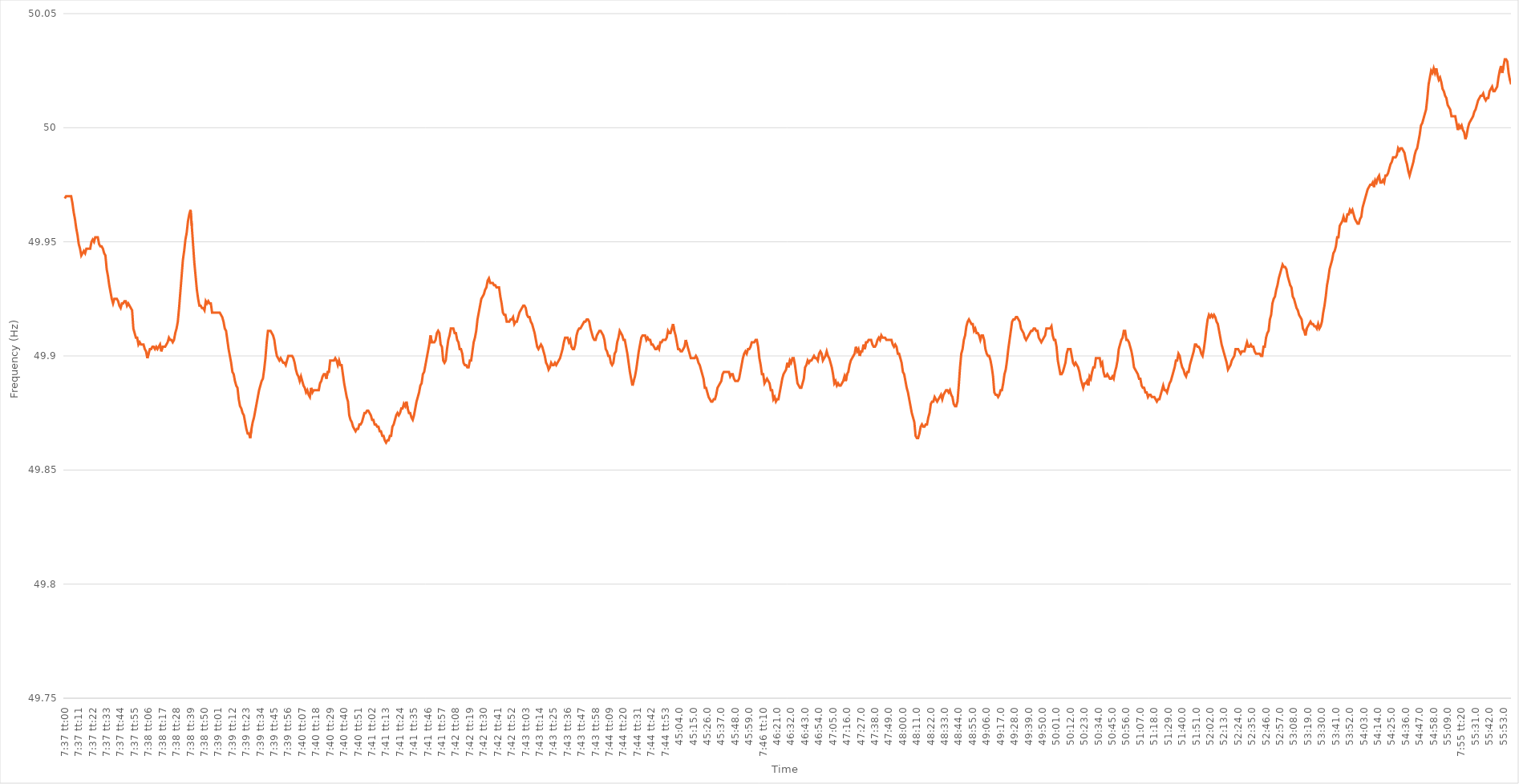
| Category | Series 0 |
|---|---|
| 0.31736111111111115 | 49.969 |
| 0.3173726851851852 | 49.97 |
| 0.3173842592592592 | 49.97 |
| 0.3173958333333333 | 49.97 |
| 0.3174074074074074 | 49.97 |
| 0.31741898148148145 | 49.97 |
| 0.31743055555555555 | 49.967 |
| 0.31744212962962964 | 49.963 |
| 0.3174537037037037 | 49.96 |
| 0.3174652777777778 | 49.956 |
| 0.31747685185185187 | 49.953 |
| 0.3174884259259259 | 49.949 |
| 0.3175 | 49.947 |
| 0.3175115740740741 | 49.944 |
| 0.31752314814814814 | 49.945 |
| 0.31753472222222223 | 49.946 |
| 0.3175462962962963 | 49.945 |
| 0.31755787037037037 | 49.947 |
| 0.3175694444444444 | 49.947 |
| 0.31758101851851855 | 49.947 |
| 0.3175925925925926 | 49.947 |
| 0.3176041666666667 | 49.95 |
| 0.3176157407407407 | 49.951 |
| 0.3176273148148148 | 49.95 |
| 0.31763888888888886 | 49.952 |
| 0.31765046296296295 | 49.952 |
| 0.31766203703703705 | 49.952 |
| 0.3176736111111111 | 49.949 |
| 0.3176851851851852 | 49.948 |
| 0.3176967592592593 | 49.948 |
| 0.3177083333333333 | 49.947 |
| 0.3177199074074074 | 49.945 |
| 0.3177314814814815 | 49.944 |
| 0.31774305555555554 | 49.938 |
| 0.31775462962962964 | 49.935 |
| 0.31776620370370373 | 49.931 |
| 0.31777777777777777 | 49.928 |
| 0.31778935185185186 | 49.925 |
| 0.31780092592592596 | 49.923 |
| 0.3178125 | 49.925 |
| 0.3178240740740741 | 49.925 |
| 0.31783564814814813 | 49.925 |
| 0.3178472222222222 | 49.924 |
| 0.31785879629629626 | 49.922 |
| 0.31787037037037036 | 49.921 |
| 0.31788194444444445 | 49.923 |
| 0.3178935185185185 | 49.923 |
| 0.3179050925925926 | 49.924 |
| 0.3179166666666667 | 49.924 |
| 0.3179282407407407 | 49.922 |
| 0.3179398148148148 | 49.923 |
| 0.3179513888888889 | 49.922 |
| 0.31796296296296295 | 49.921 |
| 0.31797453703703704 | 49.92 |
| 0.31798611111111114 | 49.912 |
| 0.3179976851851852 | 49.91 |
| 0.31800925925925927 | 49.908 |
| 0.31802083333333336 | 49.908 |
| 0.3180324074074074 | 49.905 |
| 0.3180439814814815 | 49.906 |
| 0.31805555555555554 | 49.905 |
| 0.31806712962962963 | 49.905 |
| 0.31807870370370367 | 49.905 |
| 0.31809027777777776 | 49.903 |
| 0.31810185185185186 | 49.902 |
| 0.3181134259259259 | 49.899 |
| 0.318125 | 49.901 |
| 0.3181365740740741 | 49.903 |
| 0.3181481481481481 | 49.903 |
| 0.3181597222222222 | 49.904 |
| 0.3181712962962963 | 49.904 |
| 0.31818287037037035 | 49.903 |
| 0.31819444444444445 | 49.904 |
| 0.31820601851851854 | 49.903 |
| 0.3182175925925926 | 49.904 |
| 0.3182291666666667 | 49.905 |
| 0.31824074074074077 | 49.902 |
| 0.3182523148148148 | 49.904 |
| 0.3182638888888889 | 49.904 |
| 0.318275462962963 | 49.904 |
| 0.31828703703703703 | 49.905 |
| 0.3182986111111111 | 49.906 |
| 0.3183101851851852 | 49.908 |
| 0.31832175925925926 | 49.907 |
| 0.3183333333333333 | 49.907 |
| 0.3183449074074074 | 49.906 |
| 0.3183564814814815 | 49.907 |
| 0.31836805555555553 | 49.91 |
| 0.3183796296296296 | 49.912 |
| 0.3183912037037037 | 49.915 |
| 0.31840277777777776 | 49.921 |
| 0.31841435185185185 | 49.928 |
| 0.31842592592592595 | 49.935 |
| 0.3184375 | 49.942 |
| 0.3184490740740741 | 49.946 |
| 0.3184606481481482 | 49.951 |
| 0.3184722222222222 | 49.954 |
| 0.3184837962962963 | 49.959 |
| 0.3184953703703704 | 49.962 |
| 0.31850694444444444 | 49.964 |
| 0.3185185185185185 | 49.957 |
| 0.31853009259259263 | 49.949 |
| 0.31854166666666667 | 49.941 |
| 0.31855324074074076 | 49.935 |
| 0.3185648148148148 | 49.929 |
| 0.3185763888888889 | 49.925 |
| 0.31858796296296293 | 49.922 |
| 0.31859953703703703 | 49.922 |
| 0.3186111111111111 | 49.921 |
| 0.31862268518518516 | 49.921 |
| 0.31863425925925926 | 49.92 |
| 0.31864583333333335 | 49.924 |
| 0.3186574074074074 | 49.923 |
| 0.3186689814814815 | 49.924 |
| 0.3186805555555556 | 49.923 |
| 0.3186921296296296 | 49.923 |
| 0.3187037037037037 | 49.919 |
| 0.3187152777777778 | 49.919 |
| 0.31872685185185184 | 49.919 |
| 0.31873842592592594 | 49.919 |
| 0.31875000000000003 | 49.919 |
| 0.31876157407407407 | 49.919 |
| 0.31877314814814817 | 49.919 |
| 0.3187847222222222 | 49.918 |
| 0.3187962962962963 | 49.917 |
| 0.31880787037037034 | 49.915 |
| 0.31881944444444443 | 49.912 |
| 0.3188310185185185 | 49.911 |
| 0.31884259259259257 | 49.907 |
| 0.31885416666666666 | 49.903 |
| 0.31886574074074076 | 49.9 |
| 0.3188773148148148 | 49.897 |
| 0.3188888888888889 | 49.893 |
| 0.318900462962963 | 49.892 |
| 0.318912037037037 | 49.889 |
| 0.3189236111111111 | 49.887 |
| 0.3189351851851852 | 49.886 |
| 0.31894675925925925 | 49.881 |
| 0.31895833333333334 | 49.878 |
| 0.31896990740740744 | 49.877 |
| 0.3189814814814815 | 49.875 |
| 0.31899305555555557 | 49.874 |
| 0.3190046296296296 | 49.871 |
| 0.3190162037037037 | 49.868 |
| 0.31902777777777774 | 49.866 |
| 0.31903935185185184 | 49.866 |
| 0.31905092592592593 | 49.864 |
| 0.31906249999999997 | 49.868 |
| 0.31907407407407407 | 49.871 |
| 0.31908564814814816 | 49.873 |
| 0.3190972222222222 | 49.876 |
| 0.3191087962962963 | 49.879 |
| 0.3191203703703704 | 49.882 |
| 0.3191319444444444 | 49.885 |
| 0.3191435185185185 | 49.887 |
| 0.3191550925925926 | 49.889 |
| 0.31916666666666665 | 49.89 |
| 0.31917824074074075 | 49.894 |
| 0.31918981481481484 | 49.899 |
| 0.3192013888888889 | 49.906 |
| 0.319212962962963 | 49.911 |
| 0.319224537037037 | 49.911 |
| 0.3192361111111111 | 49.911 |
| 0.31924768518518515 | 49.91 |
| 0.3192592592592593 | 49.909 |
| 0.31927083333333334 | 49.907 |
| 0.3192824074074074 | 49.903 |
| 0.31929398148148147 | 49.9 |
| 0.31930555555555556 | 49.899 |
| 0.3193171296296296 | 49.898 |
| 0.3193287037037037 | 49.899 |
| 0.3193402777777778 | 49.898 |
| 0.31935185185185183 | 49.897 |
| 0.3193634259259259 | 49.897 |
| 0.319375 | 49.896 |
| 0.31938657407407406 | 49.898 |
| 0.31939814814814815 | 49.9 |
| 0.31940972222222225 | 49.9 |
| 0.3194212962962963 | 49.9 |
| 0.3194328703703704 | 49.9 |
| 0.3194444444444445 | 49.899 |
| 0.3194560185185185 | 49.897 |
| 0.31946759259259255 | 49.894 |
| 0.3194791666666667 | 49.892 |
| 0.31949074074074074 | 49.891 |
| 0.31950231481481484 | 49.889 |
| 0.3195138888888889 | 49.891 |
| 0.31952546296296297 | 49.889 |
| 0.319537037037037 | 49.887 |
| 0.3195486111111111 | 49.886 |
| 0.3195601851851852 | 49.884 |
| 0.31957175925925924 | 49.885 |
| 0.31958333333333333 | 49.883 |
| 0.3195949074074074 | 49.882 |
| 0.31960648148148146 | 49.886 |
| 0.31961805555555556 | 49.884 |
| 0.31962962962962965 | 49.885 |
| 0.3196412037037037 | 49.885 |
| 0.3196527777777778 | 49.885 |
| 0.3196643518518519 | 49.885 |
| 0.3196759259259259 | 49.885 |
| 0.3196875 | 49.888 |
| 0.3196990740740741 | 49.889 |
| 0.31971064814814815 | 49.891 |
| 0.31972222222222224 | 49.892 |
| 0.3197337962962963 | 49.892 |
| 0.3197453703703704 | 49.89 |
| 0.3197569444444444 | 49.893 |
| 0.3197685185185185 | 49.893 |
| 0.3197800925925926 | 49.898 |
| 0.31979166666666664 | 49.898 |
| 0.31980324074074074 | 49.898 |
| 0.31981481481481483 | 49.898 |
| 0.31982638888888887 | 49.899 |
| 0.31983796296296296 | 49.898 |
| 0.31984953703703706 | 49.896 |
| 0.3198611111111111 | 49.898 |
| 0.3198726851851852 | 49.896 |
| 0.3198842592592593 | 49.896 |
| 0.3198958333333333 | 49.892 |
| 0.3199074074074074 | 49.888 |
| 0.3199189814814815 | 49.885 |
| 0.31993055555555555 | 49.882 |
| 0.31994212962962965 | 49.88 |
| 0.3199537037037037 | 49.874 |
| 0.3199652777777778 | 49.872 |
| 0.3199768518518518 | 49.871 |
| 0.3199884259259259 | 49.869 |
| 0.32 | 49.868 |
| 0.32001157407407405 | 49.867 |
| 0.32002314814814814 | 49.868 |
| 0.32003472222222223 | 49.868 |
| 0.3200462962962963 | 49.87 |
| 0.32005787037037037 | 49.87 |
| 0.32006944444444446 | 49.871 |
| 0.3200810185185185 | 49.873 |
| 0.3200925925925926 | 49.875 |
| 0.3201041666666667 | 49.875 |
| 0.32011574074074073 | 49.876 |
| 0.3201273148148148 | 49.876 |
| 0.3201388888888889 | 49.875 |
| 0.32015046296296296 | 49.874 |
| 0.32016203703703705 | 49.872 |
| 0.3201736111111111 | 49.872 |
| 0.3201851851851852 | 49.87 |
| 0.3201967592592592 | 49.87 |
| 0.3202083333333334 | 49.869 |
| 0.3202199074074074 | 49.869 |
| 0.32023148148148145 | 49.867 |
| 0.32024305555555554 | 49.867 |
| 0.32025462962962964 | 49.865 |
| 0.3202662037037037 | 49.865 |
| 0.3202777777777778 | 49.863 |
| 0.32028935185185187 | 49.862 |
| 0.3203009259259259 | 49.863 |
| 0.3203125 | 49.863 |
| 0.3203240740740741 | 49.865 |
| 0.32033564814814813 | 49.865 |
| 0.3203472222222222 | 49.869 |
| 0.3203587962962963 | 49.87 |
| 0.32037037037037036 | 49.872 |
| 0.32038194444444446 | 49.874 |
| 0.32039351851851855 | 49.875 |
| 0.3204050925925926 | 49.874 |
| 0.3204166666666666 | 49.875 |
| 0.3204282407407408 | 49.877 |
| 0.3204398148148148 | 49.877 |
| 0.3204513888888889 | 49.879 |
| 0.32046296296296295 | 49.878 |
| 0.32047453703703704 | 49.88 |
| 0.3204861111111111 | 49.877 |
| 0.3204976851851852 | 49.875 |
| 0.32050925925925927 | 49.875 |
| 0.3205208333333333 | 49.873 |
| 0.3205324074074074 | 49.872 |
| 0.3205439814814815 | 49.874 |
| 0.32055555555555554 | 49.877 |
| 0.32056712962962963 | 49.88 |
| 0.3205787037037037 | 49.882 |
| 0.32059027777777777 | 49.884 |
| 0.32060185185185186 | 49.887 |
| 0.32061342592592595 | 49.888 |
| 0.320625 | 49.892 |
| 0.3206365740740741 | 49.893 |
| 0.3206481481481482 | 49.896 |
| 0.3206597222222222 | 49.899 |
| 0.3206712962962963 | 49.902 |
| 0.32068287037037035 | 49.905 |
| 0.32069444444444445 | 49.909 |
| 0.3207060185185185 | 49.906 |
| 0.3207175925925926 | 49.906 |
| 0.3207291666666667 | 49.906 |
| 0.3207407407407407 | 49.907 |
| 0.3207523148148148 | 49.91 |
| 0.3207638888888889 | 49.911 |
| 0.32077546296296294 | 49.91 |
| 0.32078703703703704 | 49.905 |
| 0.32079861111111113 | 49.904 |
| 0.32081018518518517 | 49.898 |
| 0.32082175925925926 | 49.897 |
| 0.32083333333333336 | 49.898 |
| 0.3208449074074074 | 49.903 |
| 0.3208564814814815 | 49.907 |
| 0.3208680555555556 | 49.909 |
| 0.3208796296296296 | 49.912 |
| 0.3208912037037037 | 49.912 |
| 0.32090277777777776 | 49.912 |
| 0.32091435185185185 | 49.91 |
| 0.3209259259259259 | 49.91 |
| 0.3209375 | 49.907 |
| 0.3209490740740741 | 49.906 |
| 0.3209606481481481 | 49.903 |
| 0.3209722222222222 | 49.903 |
| 0.3209837962962963 | 49.901 |
| 0.32099537037037035 | 49.897 |
| 0.32100694444444444 | 49.896 |
| 0.32101851851851854 | 49.896 |
| 0.3210300925925926 | 49.895 |
| 0.32104166666666667 | 49.895 |
| 0.32105324074074076 | 49.898 |
| 0.3210648148148148 | 49.898 |
| 0.3210763888888889 | 49.902 |
| 0.321087962962963 | 49.906 |
| 0.32109953703703703 | 49.908 |
| 0.3211111111111111 | 49.911 |
| 0.32112268518518516 | 49.916 |
| 0.32113425925925926 | 49.919 |
| 0.3211458333333333 | 49.922 |
| 0.32115740740740745 | 49.925 |
| 0.3211689814814815 | 49.926 |
| 0.3211805555555555 | 49.927 |
| 0.3211921296296296 | 49.929 |
| 0.3212037037037037 | 49.93 |
| 0.32121527777777775 | 49.933 |
| 0.32122685185185185 | 49.934 |
| 0.32123842592592594 | 49.932 |
| 0.32125 | 49.932 |
| 0.3212615740740741 | 49.932 |
| 0.32127314814814817 | 49.931 |
| 0.3212847222222222 | 49.931 |
| 0.3212962962962963 | 49.93 |
| 0.3213078703703704 | 49.93 |
| 0.32131944444444444 | 49.93 |
| 0.32133101851851853 | 49.926 |
| 0.3213425925925926 | 49.923 |
| 0.32135416666666666 | 49.919 |
| 0.3213657407407407 | 49.918 |
| 0.32137731481481485 | 49.918 |
| 0.3213888888888889 | 49.915 |
| 0.321400462962963 | 49.915 |
| 0.321412037037037 | 49.915 |
| 0.3214236111111111 | 49.916 |
| 0.32143518518518516 | 49.916 |
| 0.32144675925925925 | 49.917 |
| 0.32145833333333335 | 49.914 |
| 0.3214699074074074 | 49.915 |
| 0.3214814814814815 | 49.915 |
| 0.3214930555555556 | 49.917 |
| 0.3215046296296296 | 49.919 |
| 0.3215162037037037 | 49.92 |
| 0.3215277777777778 | 49.921 |
| 0.32153935185185184 | 49.922 |
| 0.32155092592592593 | 49.922 |
| 0.32156250000000003 | 49.921 |
| 0.32157407407407407 | 49.918 |
| 0.32158564814814816 | 49.917 |
| 0.32159722222222226 | 49.917 |
| 0.3216087962962963 | 49.915 |
| 0.3216203703703704 | 49.914 |
| 0.32163194444444443 | 49.912 |
| 0.3216435185185185 | 49.91 |
| 0.32165509259259256 | 49.907 |
| 0.32166666666666666 | 49.904 |
| 0.32167824074074075 | 49.903 |
| 0.3216898148148148 | 49.904 |
| 0.3217013888888889 | 49.905 |
| 0.321712962962963 | 49.904 |
| 0.321724537037037 | 49.902 |
| 0.3217361111111111 | 49.9 |
| 0.3217476851851852 | 49.897 |
| 0.32175925925925924 | 49.896 |
| 0.32177083333333334 | 49.894 |
| 0.32178240740740743 | 49.895 |
| 0.3217939814814815 | 49.897 |
| 0.32180555555555557 | 49.896 |
| 0.32181712962962966 | 49.896 |
| 0.3218287037037037 | 49.897 |
| 0.3218402777777778 | 49.896 |
| 0.32185185185185183 | 49.897 |
| 0.32186342592592593 | 49.898 |
| 0.32187499999999997 | 49.899 |
| 0.32188657407407406 | 49.901 |
| 0.32189814814814816 | 49.903 |
| 0.3219097222222222 | 49.906 |
| 0.3219212962962963 | 49.908 |
| 0.3219328703703704 | 49.908 |
| 0.3219444444444444 | 49.908 |
| 0.3219560185185185 | 49.906 |
| 0.3219675925925926 | 49.907 |
| 0.32197916666666665 | 49.904 |
| 0.32199074074074074 | 49.903 |
| 0.32200231481481484 | 49.903 |
| 0.3220138888888889 | 49.905 |
| 0.32202546296296297 | 49.909 |
| 0.32203703703703707 | 49.911 |
| 0.3220486111111111 | 49.912 |
| 0.3220601851851852 | 49.912 |
| 0.32207175925925924 | 49.913 |
| 0.32208333333333333 | 49.914 |
| 0.32209490740740737 | 49.915 |
| 0.3221064814814815 | 49.915 |
| 0.32211805555555556 | 49.916 |
| 0.3221296296296296 | 49.916 |
| 0.3221412037037037 | 49.915 |
| 0.3221527777777778 | 49.912 |
| 0.3221643518518518 | 49.91 |
| 0.3221759259259259 | 49.908 |
| 0.3221875 | 49.907 |
| 0.32219907407407405 | 49.907 |
| 0.32221064814814815 | 49.909 |
| 0.32222222222222224 | 49.91 |
| 0.3222337962962963 | 49.911 |
| 0.3222453703703704 | 49.911 |
| 0.32225694444444447 | 49.91 |
| 0.3222685185185185 | 49.909 |
| 0.3222800925925926 | 49.907 |
| 0.3222916666666667 | 49.903 |
| 0.32230324074074074 | 49.902 |
| 0.3223148148148148 | 49.9 |
| 0.3223263888888889 | 49.9 |
| 0.32233796296296297 | 49.897 |
| 0.322349537037037 | 49.896 |
| 0.3223611111111111 | 49.897 |
| 0.3223726851851852 | 49.901 |
| 0.32238425925925923 | 49.902 |
| 0.3223958333333333 | 49.906 |
| 0.3224074074074074 | 49.908 |
| 0.32241898148148146 | 49.911 |
| 0.32243055555555555 | 49.91 |
| 0.32244212962962965 | 49.909 |
| 0.3224537037037037 | 49.907 |
| 0.3224652777777778 | 49.907 |
| 0.3224768518518519 | 49.904 |
| 0.3224884259259259 | 49.901 |
| 0.3225 | 49.897 |
| 0.3225115740740741 | 49.893 |
| 0.32252314814814814 | 49.89 |
| 0.32253472222222224 | 49.887 |
| 0.32254629629629633 | 49.889 |
| 0.32255787037037037 | 49.891 |
| 0.32256944444444446 | 49.894 |
| 0.3225810185185185 | 49.898 |
| 0.3225925925925926 | 49.902 |
| 0.32260416666666664 | 49.905 |
| 0.32261574074074073 | 49.908 |
| 0.3226273148148148 | 49.909 |
| 0.32263888888888886 | 49.909 |
| 0.32265046296296296 | 49.909 |
| 0.32266203703703705 | 49.907 |
| 0.3226736111111111 | 49.908 |
| 0.3226851851851852 | 49.907 |
| 0.3226967592592593 | 49.907 |
| 0.3227083333333333 | 49.905 |
| 0.3227199074074074 | 49.905 |
| 0.3227314814814815 | 49.904 |
| 0.32274305555555555 | 49.903 |
| 0.32275462962962964 | 49.903 |
| 0.32276620370370374 | 49.904 |
| 0.3227777777777778 | 49.903 |
| 0.32278935185185187 | 49.906 |
| 0.3228009259259259 | 49.906 |
| 0.3228125 | 49.907 |
| 0.32282407407407404 | 49.907 |
| 0.32283564814814814 | 49.907 |
| 0.32284722222222223 | 49.908 |
| 0.32285879629629627 | 49.911 |
| 0.32287037037037036 | 49.91 |
| 0.32288194444444446 | 49.91 |
| 0.3228935185185185 | 49.912 |
| 0.3229050925925926 | 49.914 |
| 0.3229166666666667 | 49.911 |
| 0.3229282407407407 | 49.909 |
| 0.3229398148148148 | 49.906 |
| 0.3229513888888889 | 49.903 |
| 0.32296296296296295 | 49.903 |
| 0.32297453703703705 | 49.902 |
| 0.32298611111111114 | 49.902 |
| 0.3229976851851852 | 49.903 |
| 0.3230092592592593 | 49.904 |
| 0.3230208333333333 | 49.907 |
| 0.3230324074074074 | 49.905 |
| 0.32304398148148145 | 49.903 |
| 0.3230555555555556 | 49.901 |
| 0.32306712962962963 | 49.899 |
| 0.3230787037037037 | 49.899 |
| 0.32309027777777777 | 49.899 |
| 0.32310185185185186 | 49.899 |
| 0.3231134259259259 | 49.9 |
| 0.323125 | 49.899 |
| 0.3231365740740741 | 49.897 |
| 0.32314814814814813 | 49.896 |
| 0.3231597222222222 | 49.894 |
| 0.3231712962962963 | 49.892 |
| 0.32318287037037036 | 49.89 |
| 0.32319444444444445 | 49.886 |
| 0.32320601851851855 | 49.886 |
| 0.3232175925925926 | 49.884 |
| 0.3232291666666667 | 49.882 |
| 0.3232407407407408 | 49.881 |
| 0.3232523148148148 | 49.88 |
| 0.32326388888888885 | 49.88 |
| 0.323275462962963 | 49.881 |
| 0.32328703703703704 | 49.881 |
| 0.3232986111111111 | 49.883 |
| 0.3233101851851852 | 49.886 |
| 0.32332175925925927 | 49.887 |
| 0.3233333333333333 | 49.888 |
| 0.3233449074074074 | 49.889 |
| 0.3233564814814815 | 49.892 |
| 0.32336805555555553 | 49.893 |
| 0.32337962962962963 | 49.893 |
| 0.3233912037037037 | 49.893 |
| 0.32340277777777776 | 49.893 |
| 0.32341435185185186 | 49.893 |
| 0.32342592592592595 | 49.891 |
| 0.3234375 | 49.892 |
| 0.3234490740740741 | 49.892 |
| 0.3234606481481482 | 49.89 |
| 0.3234722222222222 | 49.889 |
| 0.3234837962962963 | 49.889 |
| 0.3234953703703704 | 49.889 |
| 0.32350694444444444 | 49.89 |
| 0.32351851851851854 | 49.893 |
| 0.3235300925925926 | 49.896 |
| 0.32354166666666667 | 49.899 |
| 0.3235532407407407 | 49.901 |
| 0.3235648148148148 | 49.902 |
| 0.3235763888888889 | 49.901 |
| 0.32358796296296294 | 49.903 |
| 0.32359953703703703 | 49.903 |
| 0.3236111111111111 | 49.904 |
| 0.32362268518518517 | 49.906 |
| 0.32363425925925926 | 49.906 |
| 0.32364583333333335 | 49.906 |
| 0.3236574074074074 | 49.907 |
| 0.3236689814814815 | 49.907 |
| 0.3236805555555556 | 49.904 |
| 0.3236921296296296 | 49.899 |
| 0.3237037037037037 | 49.896 |
| 0.3237152777777778 | 49.892 |
| 0.32372685185185185 | 49.892 |
| 0.32373842592592594 | 49.888 |
| 0.32375 | 49.889 |
| 0.3237615740740741 | 49.89 |
| 0.3237731481481481 | 49.889 |
| 0.3237847222222222 | 49.888 |
| 0.3237962962962963 | 49.885 |
| 0.32380787037037034 | 49.885 |
| 0.32381944444444444 | 49.881 |
| 0.32383101851851853 | 49.882 |
| 0.32384259259259257 | 49.88 |
| 0.32385416666666667 | 49.881 |
| 0.32386574074074076 | 49.881 |
| 0.3238773148148148 | 49.884 |
| 0.3238888888888889 | 49.887 |
| 0.323900462962963 | 49.89 |
| 0.323912037037037 | 49.892 |
| 0.3239236111111111 | 49.893 |
| 0.3239351851851852 | 49.894 |
| 0.32394675925925925 | 49.897 |
| 0.32395833333333335 | 49.895 |
| 0.3239699074074074 | 49.898 |
| 0.3239814814814815 | 49.897 |
| 0.3239930555555555 | 49.899 |
| 0.32400462962962967 | 49.899 |
| 0.3240162037037037 | 49.896 |
| 0.32402777777777775 | 49.892 |
| 0.32403935185185184 | 49.888 |
| 0.32405092592592594 | 49.887 |
| 0.3240625 | 49.886 |
| 0.32407407407407407 | 49.886 |
| 0.32408564814814816 | 49.888 |
| 0.3240972222222222 | 49.89 |
| 0.3241087962962963 | 49.895 |
| 0.3241203703703704 | 49.896 |
| 0.32413194444444443 | 49.898 |
| 0.3241435185185185 | 49.897 |
| 0.3241550925925926 | 49.898 |
| 0.32416666666666666 | 49.898 |
| 0.32417824074074075 | 49.899 |
| 0.32418981481481485 | 49.9 |
| 0.3242013888888889 | 49.899 |
| 0.3242129629629629 | 49.899 |
| 0.3242245370370371 | 49.898 |
| 0.3242361111111111 | 49.901 |
| 0.32424768518518515 | 49.902 |
| 0.32425925925925925 | 49.901 |
| 0.32427083333333334 | 49.898 |
| 0.3242824074074074 | 49.899 |
| 0.3242939814814815 | 49.9 |
| 0.32430555555555557 | 49.902 |
| 0.3243171296296296 | 49.9 |
| 0.3243287037037037 | 49.899 |
| 0.3243402777777778 | 49.897 |
| 0.32435185185185184 | 49.895 |
| 0.32436342592592593 | 49.892 |
| 0.324375 | 49.888 |
| 0.32438657407407406 | 49.889 |
| 0.32439814814814816 | 49.887 |
| 0.32440972222222225 | 49.888 |
| 0.3244212962962963 | 49.887 |
| 0.32443287037037033 | 49.887 |
| 0.3244444444444445 | 49.888 |
| 0.3244560185185185 | 49.889 |
| 0.3244675925925926 | 49.891 |
| 0.32447916666666665 | 49.889 |
| 0.32449074074074075 | 49.892 |
| 0.3245023148148148 | 49.893 |
| 0.3245138888888889 | 49.896 |
| 0.324525462962963 | 49.898 |
| 0.324537037037037 | 49.899 |
| 0.3245486111111111 | 49.9 |
| 0.3245601851851852 | 49.901 |
| 0.32457175925925924 | 49.904 |
| 0.32458333333333333 | 49.902 |
| 0.32459490740740743 | 49.903 |
| 0.32460648148148147 | 49.9 |
| 0.32461805555555556 | 49.902 |
| 0.32462962962962966 | 49.902 |
| 0.3246412037037037 | 49.905 |
| 0.3246527777777778 | 49.903 |
| 0.3246643518518519 | 49.906 |
| 0.3246759259259259 | 49.906 |
| 0.3246875 | 49.907 |
| 0.32469907407407406 | 49.907 |
| 0.32471064814814815 | 49.907 |
| 0.3247222222222222 | 49.905 |
| 0.3247337962962963 | 49.904 |
| 0.3247453703703704 | 49.904 |
| 0.3247569444444444 | 49.905 |
| 0.3247685185185185 | 49.907 |
| 0.3247800925925926 | 49.908 |
| 0.32479166666666665 | 49.907 |
| 0.32480324074074074 | 49.909 |
| 0.32481481481481483 | 49.908 |
| 0.3248263888888889 | 49.908 |
| 0.32483796296296297 | 49.908 |
| 0.32484953703703706 | 49.907 |
| 0.3248611111111111 | 49.907 |
| 0.3248726851851852 | 49.907 |
| 0.3248842592592593 | 49.907 |
| 0.32489583333333333 | 49.907 |
| 0.3249074074074074 | 49.905 |
| 0.32491898148148146 | 49.904 |
| 0.32493055555555556 | 49.905 |
| 0.3249421296296296 | 49.904 |
| 0.3249537037037037 | 49.901 |
| 0.3249652777777778 | 49.901 |
| 0.3249768518518518 | 49.899 |
| 0.3249884259259259 | 49.897 |
| 0.325 | 49.893 |
| 0.32501157407407405 | 49.892 |
| 0.32502314814814814 | 49.889 |
| 0.32503472222222224 | 49.886 |
| 0.3250462962962963 | 49.884 |
| 0.32505787037037037 | 49.881 |
| 0.32506944444444447 | 49.878 |
| 0.3250810185185185 | 49.875 |
| 0.3250925925925926 | 49.873 |
| 0.3251041666666667 | 49.871 |
| 0.32511574074074073 | 49.865 |
| 0.3251273148148148 | 49.864 |
| 0.3251388888888889 | 49.864 |
| 0.32515046296296296 | 49.866 |
| 0.325162037037037 | 49.869 |
| 0.32517361111111115 | 49.87 |
| 0.3251851851851852 | 49.869 |
| 0.3251967592592592 | 49.869 |
| 0.3252083333333333 | 49.87 |
| 0.3252199074074074 | 49.87 |
| 0.32523148148148145 | 49.873 |
| 0.32524305555555555 | 49.875 |
| 0.32525462962962964 | 49.879 |
| 0.3252662037037037 | 49.88 |
| 0.3252777777777778 | 49.88 |
| 0.32528935185185187 | 49.882 |
| 0.3253009259259259 | 49.881 |
| 0.3253125 | 49.88 |
| 0.3253240740740741 | 49.881 |
| 0.32533564814814814 | 49.882 |
| 0.32534722222222223 | 49.883 |
| 0.3253587962962963 | 49.881 |
| 0.32537037037037037 | 49.883 |
| 0.3253819444444444 | 49.884 |
| 0.32539351851851855 | 49.885 |
| 0.3254050925925926 | 49.885 |
| 0.3254166666666667 | 49.884 |
| 0.3254282407407407 | 49.885 |
| 0.3254398148148148 | 49.883 |
| 0.32545138888888886 | 49.882 |
| 0.32546296296296295 | 49.879 |
| 0.32547453703703705 | 49.878 |
| 0.3254861111111111 | 49.878 |
| 0.3254976851851852 | 49.88 |
| 0.3255092592592593 | 49.887 |
| 0.3255208333333333 | 49.895 |
| 0.3255324074074074 | 49.901 |
| 0.3255439814814815 | 49.903 |
| 0.32555555555555554 | 49.907 |
| 0.32556712962962964 | 49.909 |
| 0.32557870370370373 | 49.913 |
| 0.32559027777777777 | 49.915 |
| 0.32560185185185186 | 49.916 |
| 0.32561342592592596 | 49.915 |
| 0.325625 | 49.914 |
| 0.3256365740740741 | 49.914 |
| 0.32564814814814813 | 49.911 |
| 0.3256597222222222 | 49.912 |
| 0.32567129629629626 | 49.91 |
| 0.32568287037037036 | 49.91 |
| 0.32569444444444445 | 49.909 |
| 0.3257060185185185 | 49.907 |
| 0.3257175925925926 | 49.909 |
| 0.3257291666666667 | 49.909 |
| 0.3257407407407407 | 49.907 |
| 0.3257523148148148 | 49.903 |
| 0.3257638888888889 | 49.901 |
| 0.32577546296296295 | 49.9 |
| 0.32578703703703704 | 49.9 |
| 0.32579861111111114 | 49.898 |
| 0.3258101851851852 | 49.895 |
| 0.32582175925925927 | 49.891 |
| 0.32583333333333336 | 49.884 |
| 0.3258449074074074 | 49.883 |
| 0.3258564814814815 | 49.883 |
| 0.32586805555555554 | 49.882 |
| 0.32587962962962963 | 49.883 |
| 0.32589120370370367 | 49.885 |
| 0.32590277777777776 | 49.885 |
| 0.32591435185185186 | 49.888 |
| 0.3259259259259259 | 49.892 |
| 0.3259375 | 49.894 |
| 0.3259490740740741 | 49.898 |
| 0.3259606481481481 | 49.903 |
| 0.3259722222222222 | 49.907 |
| 0.3259837962962963 | 49.911 |
| 0.32599537037037035 | 49.915 |
| 0.32600694444444445 | 49.916 |
| 0.32601851851851854 | 49.916 |
| 0.3260300925925926 | 49.917 |
| 0.3260416666666667 | 49.917 |
| 0.32605324074074077 | 49.916 |
| 0.3260648148148148 | 49.915 |
| 0.3260763888888889 | 49.912 |
| 0.326087962962963 | 49.911 |
| 0.32609953703703703 | 49.91 |
| 0.3261111111111111 | 49.908 |
| 0.3261226851851852 | 49.907 |
| 0.32613425925925926 | 49.908 |
| 0.3261458333333333 | 49.909 |
| 0.3261574074074074 | 49.91 |
| 0.3261689814814815 | 49.911 |
| 0.32618055555555553 | 49.911 |
| 0.3261921296296296 | 49.912 |
| 0.3262037037037037 | 49.912 |
| 0.32621527777777776 | 49.911 |
| 0.32622685185185185 | 49.911 |
| 0.32623842592592595 | 49.908 |
| 0.32625 | 49.907 |
| 0.3262615740740741 | 49.906 |
| 0.3262731481481482 | 49.907 |
| 0.3262847222222222 | 49.908 |
| 0.3262962962962963 | 49.909 |
| 0.3263078703703704 | 49.912 |
| 0.32631944444444444 | 49.912 |
| 0.3263310185185185 | 49.912 |
| 0.32634259259259263 | 49.912 |
| 0.32635416666666667 | 49.913 |
| 0.32636574074074076 | 49.909 |
| 0.3263773148148148 | 49.907 |
| 0.3263888888888889 | 49.907 |
| 0.32640046296296293 | 49.904 |
| 0.32641203703703703 | 49.898 |
| 0.3264236111111111 | 49.895 |
| 0.32643518518518516 | 49.892 |
| 0.32644675925925926 | 49.892 |
| 0.32645833333333335 | 49.893 |
| 0.3264699074074074 | 49.895 |
| 0.3264814814814815 | 49.897 |
| 0.3264930555555556 | 49.901 |
| 0.3265046296296296 | 49.903 |
| 0.3265162037037037 | 49.903 |
| 0.3265277777777778 | 49.903 |
| 0.32653935185185184 | 49.9 |
| 0.32655092592592594 | 49.897 |
| 0.32656250000000003 | 49.896 |
| 0.32657407407407407 | 49.897 |
| 0.32658564814814817 | 49.896 |
| 0.3265972222222222 | 49.895 |
| 0.3266087962962963 | 49.893 |
| 0.32662037037037034 | 49.89 |
| 0.32663194444444443 | 49.888 |
| 0.3266435185185185 | 49.886 |
| 0.32665509259259257 | 49.888 |
| 0.32666666666666666 | 49.888 |
| 0.32667824074074076 | 49.889 |
| 0.3266898148148148 | 49.887 |
| 0.3267013888888889 | 49.891 |
| 0.326712962962963 | 49.89 |
| 0.326724537037037 | 49.893 |
| 0.3267361111111111 | 49.895 |
| 0.3267476851851852 | 49.895 |
| 0.32675925925925925 | 49.899 |
| 0.32677083333333334 | 49.899 |
| 0.32678240740740744 | 49.899 |
| 0.3267939814814815 | 49.899 |
| 0.32680555555555557 | 49.896 |
| 0.3268171296296296 | 49.897 |
| 0.3268287037037037 | 49.893 |
| 0.32684027777777774 | 49.891 |
| 0.32685185185185184 | 49.891 |
| 0.32686342592592593 | 49.892 |
| 0.32687499999999997 | 49.891 |
| 0.32688657407407407 | 49.89 |
| 0.32689814814814816 | 49.89 |
| 0.3269097222222222 | 49.891 |
| 0.3269212962962963 | 49.89 |
| 0.3269328703703704 | 49.893 |
| 0.3269444444444444 | 49.895 |
| 0.3269560185185185 | 49.898 |
| 0.3269675925925926 | 49.903 |
| 0.32697916666666665 | 49.905 |
| 0.32699074074074075 | 49.907 |
| 0.32700231481481484 | 49.908 |
| 0.3270138888888889 | 49.911 |
| 0.327025462962963 | 49.911 |
| 0.327037037037037 | 49.907 |
| 0.3270486111111111 | 49.907 |
| 0.32706018518518515 | 49.906 |
| 0.3270717592592593 | 49.904 |
| 0.32708333333333334 | 49.902 |
| 0.3270949074074074 | 49.899 |
| 0.32710648148148147 | 49.895 |
| 0.32711805555555556 | 49.894 |
| 0.3271296296296296 | 49.893 |
| 0.3271412037037037 | 49.892 |
| 0.3271527777777778 | 49.89 |
| 0.32716435185185183 | 49.89 |
| 0.3271759259259259 | 49.887 |
| 0.3271875 | 49.886 |
| 0.32719907407407406 | 49.886 |
| 0.32721064814814815 | 49.884 |
| 0.32722222222222225 | 49.884 |
| 0.3272337962962963 | 49.882 |
| 0.3272453703703704 | 49.883 |
| 0.3272569444444445 | 49.883 |
| 0.3272685185185185 | 49.882 |
| 0.32728009259259255 | 49.882 |
| 0.3272916666666667 | 49.882 |
| 0.32730324074074074 | 49.881 |
| 0.32731481481481484 | 49.88 |
| 0.3273263888888889 | 49.881 |
| 0.32733796296296297 | 49.881 |
| 0.327349537037037 | 49.883 |
| 0.3273611111111111 | 49.885 |
| 0.3273726851851852 | 49.887 |
| 0.32738425925925924 | 49.885 |
| 0.32739583333333333 | 49.885 |
| 0.3274074074074074 | 49.884 |
| 0.32741898148148146 | 49.886 |
| 0.32743055555555556 | 49.888 |
| 0.32744212962962965 | 49.889 |
| 0.3274537037037037 | 49.891 |
| 0.3274652777777778 | 49.893 |
| 0.3274768518518519 | 49.895 |
| 0.3274884259259259 | 49.898 |
| 0.3275 | 49.898 |
| 0.3275115740740741 | 49.901 |
| 0.32752314814814815 | 49.9 |
| 0.32753472222222224 | 49.897 |
| 0.3275462962962963 | 49.895 |
| 0.3275578703703704 | 49.894 |
| 0.3275694444444444 | 49.892 |
| 0.3275810185185185 | 49.891 |
| 0.3275925925925926 | 49.893 |
| 0.32760416666666664 | 49.893 |
| 0.32761574074074074 | 49.896 |
| 0.32762731481481483 | 49.898 |
| 0.32763888888888887 | 49.9 |
| 0.32765046296296296 | 49.902 |
| 0.32766203703703706 | 49.905 |
| 0.3276736111111111 | 49.905 |
| 0.3276851851851852 | 49.904 |
| 0.3276967592592593 | 49.904 |
| 0.3277083333333333 | 49.903 |
| 0.3277199074074074 | 49.901 |
| 0.3277314814814815 | 49.9 |
| 0.32774305555555555 | 49.903 |
| 0.32775462962962965 | 49.907 |
| 0.3277662037037037 | 49.912 |
| 0.3277777777777778 | 49.916 |
| 0.3277893518518518 | 49.918 |
| 0.3278009259259259 | 49.917 |
| 0.3278125 | 49.918 |
| 0.32782407407407405 | 49.917 |
| 0.32783564814814814 | 49.918 |
| 0.32784722222222223 | 49.917 |
| 0.3278587962962963 | 49.915 |
| 0.32787037037037037 | 49.914 |
| 0.32788194444444446 | 49.911 |
| 0.3278935185185185 | 49.908 |
| 0.3279050925925926 | 49.905 |
| 0.3279166666666667 | 49.903 |
| 0.32792824074074073 | 49.901 |
| 0.3279398148148148 | 49.899 |
| 0.3279513888888889 | 49.897 |
| 0.32796296296296296 | 49.894 |
| 0.32797453703703705 | 49.895 |
| 0.3279861111111111 | 49.896 |
| 0.3279976851851852 | 49.898 |
| 0.3280092592592592 | 49.899 |
| 0.3280208333333334 | 49.9 |
| 0.3280324074074074 | 49.903 |
| 0.32804398148148145 | 49.903 |
| 0.32805555555555554 | 49.903 |
| 0.32806712962962964 | 49.902 |
| 0.3280787037037037 | 49.901 |
| 0.3280902777777778 | 49.902 |
| 0.32810185185185187 | 49.902 |
| 0.3281134259259259 | 49.902 |
| 0.328125 | 49.904 |
| 0.3281365740740741 | 49.906 |
| 0.32814814814814813 | 49.904 |
| 0.3281597222222222 | 49.904 |
| 0.3281712962962963 | 49.905 |
| 0.32818287037037036 | 49.904 |
| 0.32819444444444446 | 49.904 |
| 0.32820601851851855 | 49.902 |
| 0.3282175925925926 | 49.901 |
| 0.3282291666666666 | 49.901 |
| 0.3282407407407408 | 49.901 |
| 0.3282523148148148 | 49.901 |
| 0.3282638888888889 | 49.9 |
| 0.32827546296296295 | 49.9 |
| 0.32828703703703704 | 49.904 |
| 0.3282986111111111 | 49.904 |
| 0.3283101851851852 | 49.908 |
| 0.32832175925925927 | 49.91 |
| 0.3283333333333333 | 49.911 |
| 0.3283449074074074 | 49.916 |
| 0.3283564814814815 | 49.918 |
| 0.32836805555555554 | 49.923 |
| 0.32837962962962963 | 49.925 |
| 0.3283912037037037 | 49.926 |
| 0.32840277777777777 | 49.929 |
| 0.32841435185185186 | 49.931 |
| 0.32842592592592595 | 49.934 |
| 0.3284375 | 49.936 |
| 0.3284490740740741 | 49.938 |
| 0.3284606481481482 | 49.94 |
| 0.3284722222222222 | 49.939 |
| 0.3284837962962963 | 49.939 |
| 0.32849537037037035 | 49.938 |
| 0.32850694444444445 | 49.935 |
| 0.3285185185185185 | 49.933 |
| 0.3285300925925926 | 49.931 |
| 0.3285416666666667 | 49.93 |
| 0.3285532407407407 | 49.926 |
| 0.3285648148148148 | 49.925 |
| 0.3285763888888889 | 49.923 |
| 0.32858796296296294 | 49.921 |
| 0.32859953703703704 | 49.92 |
| 0.32861111111111113 | 49.918 |
| 0.32862268518518517 | 49.917 |
| 0.32863425925925926 | 49.916 |
| 0.32864583333333336 | 49.912 |
| 0.3286574074074074 | 49.911 |
| 0.3286689814814815 | 49.909 |
| 0.3286805555555556 | 49.912 |
| 0.3286921296296296 | 49.913 |
| 0.3287037037037037 | 49.914 |
| 0.32871527777777776 | 49.915 |
| 0.32872685185185185 | 49.914 |
| 0.3287384259259259 | 49.914 |
| 0.32875 | 49.913 |
| 0.3287615740740741 | 49.913 |
| 0.3287731481481481 | 49.912 |
| 0.3287847222222222 | 49.914 |
| 0.3287962962962963 | 49.912 |
| 0.32880787037037035 | 49.913 |
| 0.32881944444444444 | 49.915 |
| 0.32883101851851854 | 49.919 |
| 0.3288425925925926 | 49.922 |
| 0.32885416666666667 | 49.926 |
| 0.32886574074074076 | 49.931 |
| 0.3288773148148148 | 49.934 |
| 0.3288888888888889 | 49.938 |
| 0.328900462962963 | 49.94 |
| 0.32891203703703703 | 49.942 |
| 0.3289236111111111 | 49.945 |
| 0.32893518518518516 | 49.946 |
| 0.32894675925925926 | 49.948 |
| 0.3289583333333333 | 49.952 |
| 0.32896990740740745 | 49.952 |
| 0.3289814814814815 | 49.957 |
| 0.3289930555555555 | 49.958 |
| 0.3290046296296296 | 49.959 |
| 0.3290162037037037 | 49.961 |
| 0.32902777777777775 | 49.959 |
| 0.32903935185185185 | 49.959 |
| 0.32905092592592594 | 49.962 |
| 0.3290625 | 49.962 |
| 0.3290740740740741 | 49.964 |
| 0.32908564814814817 | 49.963 |
| 0.3290972222222222 | 49.964 |
| 0.3291087962962963 | 49.962 |
| 0.3291203703703704 | 49.96 |
| 0.32913194444444444 | 49.959 |
| 0.32914351851851853 | 49.958 |
| 0.3291550925925926 | 49.958 |
| 0.32916666666666666 | 49.96 |
| 0.3291782407407407 | 49.961 |
| 0.32918981481481485 | 49.965 |
| 0.3292013888888889 | 49.967 |
| 0.329212962962963 | 49.969 |
| 0.329224537037037 | 49.971 |
| 0.3292361111111111 | 49.973 |
| 0.32924768518518516 | 49.974 |
| 0.32925925925925925 | 49.975 |
| 0.32927083333333335 | 49.975 |
| 0.3292824074074074 | 49.976 |
| 0.3292939814814815 | 49.974 |
| 0.3293055555555556 | 49.977 |
| 0.3293171296296296 | 49.976 |
| 0.3293287037037037 | 49.978 |
| 0.3293402777777778 | 49.979 |
| 0.32935185185185184 | 49.976 |
| 0.32936342592592593 | 49.976 |
| 0.32937500000000003 | 49.977 |
| 0.32938657407407407 | 49.976 |
| 0.32939814814814816 | 49.979 |
| 0.32940972222222226 | 49.979 |
| 0.3294212962962963 | 49.98 |
| 0.3294328703703704 | 49.982 |
| 0.32944444444444443 | 49.984 |
| 0.3294560185185185 | 49.985 |
| 0.32946759259259256 | 49.987 |
| 0.32947916666666666 | 49.987 |
| 0.32949074074074075 | 49.987 |
| 0.3295023148148148 | 49.988 |
| 0.3295138888888889 | 49.991 |
| 0.329525462962963 | 49.99 |
| 0.329537037037037 | 49.991 |
| 0.3295486111111111 | 49.991 |
| 0.3295601851851852 | 49.99 |
| 0.32957175925925924 | 49.989 |
| 0.32958333333333334 | 49.986 |
| 0.32959490740740743 | 49.984 |
| 0.3296064814814815 | 49.981 |
| 0.32961805555555557 | 49.979 |
| 0.32962962962962966 | 49.981 |
| 0.3296412037037037 | 49.983 |
| 0.3296527777777778 | 49.985 |
| 0.32966435185185183 | 49.988 |
| 0.32967592592592593 | 49.99 |
| 0.32968749999999997 | 49.991 |
| 0.32969907407407406 | 49.994 |
| 0.32971064814814816 | 49.997 |
| 0.3297222222222222 | 50.001 |
| 0.3297337962962963 | 50.002 |
| 0.3297453703703704 | 50.004 |
| 0.3297569444444444 | 50.006 |
| 0.3297685185185185 | 50.008 |
| 0.3297800925925926 | 50.013 |
| 0.32979166666666665 | 50.019 |
| 0.32980324074074074 | 50.022 |
| 0.32981481481481484 | 50.025 |
| 0.3298263888888889 | 50.024 |
| 0.32983796296296297 | 50.026 |
| 0.32984953703703707 | 50.024 |
| 0.3298611111111111 | 50.026 |
| 0.3298726851851852 | 50.023 |
| 0.32988425925925924 | 50.021 |
| 0.32989583333333333 | 50.022 |
| 0.32990740740740737 | 50.02 |
| 0.3299189814814815 | 50.017 |
| 0.32993055555555556 | 50.016 |
| 0.3299421296296296 | 50.014 |
| 0.3299537037037037 | 50.013 |
| 0.3299652777777778 | 50.01 |
| 0.3299768518518518 | 50.009 |
| 0.3299884259259259 | 50.008 |
| 0.33 | 50.005 |
| 0.33001157407407405 | 50.005 |
| 0.33002314814814815 | 50.005 |
| 0.33003472222222224 | 50.005 |
| 0.3300462962962963 | 50.002 |
| 0.3300578703703704 | 49.999 |
| 0.33006944444444447 | 50.001 |
| 0.3300810185185185 | 50 |
| 0.3300925925925926 | 50.001 |
| 0.3301041666666667 | 49.999 |
| 0.33011574074074074 | 49.998 |
| 0.3301273148148148 | 49.995 |
| 0.3301388888888889 | 49.997 |
| 0.33015046296296297 | 50 |
| 0.330162037037037 | 50.002 |
| 0.3301736111111111 | 50.003 |
| 0.3301851851851852 | 50.004 |
| 0.33019675925925923 | 50.005 |
| 0.3302083333333333 | 50.007 |
| 0.3302199074074074 | 50.008 |
| 0.33023148148148146 | 50.01 |
| 0.33024305555555555 | 50.012 |
| 0.33025462962962965 | 50.013 |
| 0.3302662037037037 | 50.014 |
| 0.3302777777777778 | 50.014 |
| 0.3302893518518519 | 50.015 |
| 0.3303009259259259 | 50.013 |
| 0.3303125 | 50.012 |
| 0.3303240740740741 | 50.013 |
| 0.33033564814814814 | 50.013 |
| 0.33034722222222224 | 50.016 |
| 0.33035879629629633 | 50.017 |
| 0.33037037037037037 | 50.018 |
| 0.33038194444444446 | 50.016 |
| 0.3303935185185185 | 50.016 |
| 0.3304050925925926 | 50.017 |
| 0.33041666666666664 | 50.018 |
| 0.33042824074074073 | 50.022 |
| 0.3304398148148148 | 50.025 |
| 0.33045138888888886 | 50.027 |
| 0.33046296296296296 | 50.024 |
| 0.33047453703703705 | 50.027 |
| 0.3304861111111111 | 50.03 |
| 0.3304976851851852 | 50.03 |
| 0.3305092592592593 | 50.029 |
| 0.3305208333333333 | 50.024 |
| 0.3305324074074074 | 50.021 |
| 0.3305439814814815 | 50.019 |